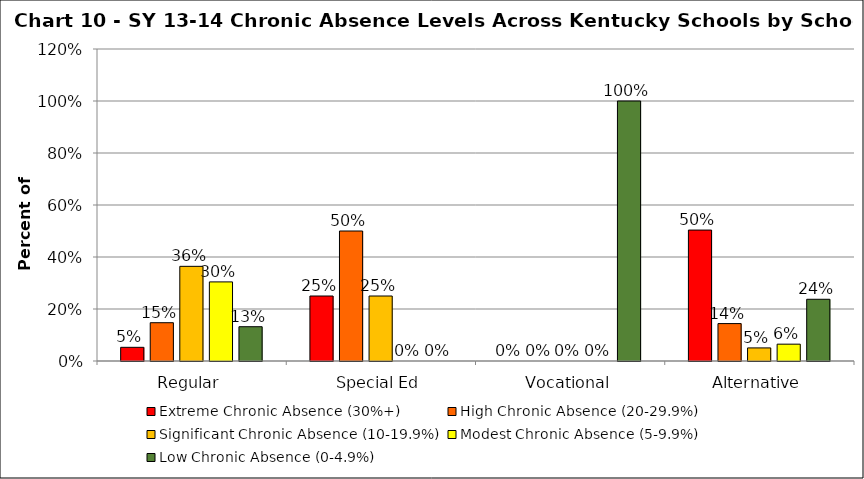
| Category | Extreme Chronic Absence (30%+) | High Chronic Absence (20-29.9%) | Significant Chronic Absence (10-19.9%) | Modest Chronic Absence (5-9.9%) | Low Chronic Absence (0-4.9%) |
|---|---|---|---|---|---|
| 0 | 0.053 | 0.147 | 0.364 | 0.304 | 0.132 |
| 1 | 0.25 | 0.5 | 0.25 | 0 | 0 |
| 2 | 0 | 0 | 0 | 0 | 1 |
| 3 | 0.504 | 0.144 | 0.05 | 0.065 | 0.237 |